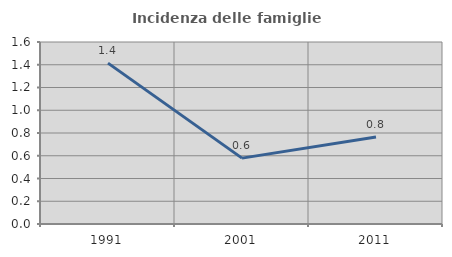
| Category | Incidenza delle famiglie numerose |
|---|---|
| 1991.0 | 1.414 |
| 2001.0 | 0.579 |
| 2011.0 | 0.765 |